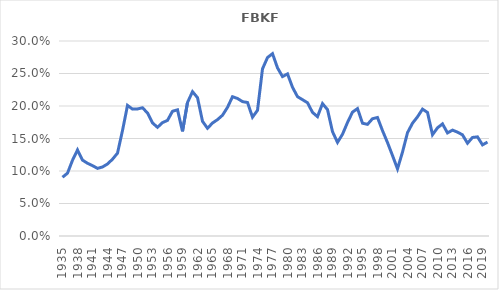
| Category | FBKF porcentaje del  PIB |
|---|---|
| 1935.0 | 0.09 |
| 1936.0 | 0.097 |
| 1937.0 | 0.117 |
| 1938.0 | 0.132 |
| 1939.0 | 0.117 |
| 1940.0 | 0.112 |
| 1941.0 | 0.108 |
| 1942.0 | 0.104 |
| 1943.0 | 0.106 |
| 1944.0 | 0.111 |
| 1945.0 | 0.118 |
| 1946.0 | 0.127 |
| 1947.0 | 0.162 |
| 1948.0 | 0.201 |
| 1949.0 | 0.195 |
| 1950.0 | 0.195 |
| 1951.0 | 0.197 |
| 1952.0 | 0.189 |
| 1953.0 | 0.174 |
| 1954.0 | 0.167 |
| 1955.0 | 0.174 |
| 1956.0 | 0.178 |
| 1957.0 | 0.192 |
| 1958.0 | 0.194 |
| 1959.0 | 0.161 |
| 1960.0 | 0.205 |
| 1961.0 | 0.222 |
| 1962.0 | 0.213 |
| 1963.0 | 0.176 |
| 1964.0 | 0.166 |
| 1965.0 | 0.174 |
| 1966.0 | 0.179 |
| 1967.0 | 0.186 |
| 1968.0 | 0.198 |
| 1969.0 | 0.214 |
| 1970.0 | 0.212 |
| 1971.0 | 0.207 |
| 1972.0 | 0.205 |
| 1973.0 | 0.183 |
| 1974.0 | 0.193 |
| 1975.0 | 0.257 |
| 1976.0 | 0.275 |
| 1977.0 | 0.281 |
| 1978.0 | 0.259 |
| 1979.0 | 0.245 |
| 1980.0 | 0.249 |
| 1981.0 | 0.229 |
| 1982.0 | 0.214 |
| 1983.0 | 0.21 |
| 1984.0 | 0.205 |
| 1985.0 | 0.19 |
| 1986.0 | 0.184 |
| 1987.0 | 0.204 |
| 1988.0 | 0.194 |
| 1989.0 | 0.161 |
| 1990.0 | 0.144 |
| 1991.0 | 0.157 |
| 1992.0 | 0.175 |
| 1993.0 | 0.191 |
| 1994.0 | 0.196 |
| 1995.0 | 0.174 |
| 1996.0 | 0.172 |
| 1997.0 | 0.18 |
| 1998.0 | 0.182 |
| 1999.0 | 0.162 |
| 2000.0 | 0.144 |
| 2001.0 | 0.124 |
| 2002.0 | 0.103 |
| 2003.0 | 0.129 |
| 2004.0 | 0.159 |
| 2005.0 | 0.174 |
| 2006.0 | 0.183 |
| 2007.0 | 0.195 |
| 2008.0 | 0.19 |
| 2009.0 | 0.156 |
| 2010.0 | 0.166 |
| 2011.0 | 0.172 |
| 2012.0 | 0.159 |
| 2013.0 | 0.163 |
| 2014.0 | 0.16 |
| 2015.0 | 0.156 |
| 2016.0 | 0.143 |
| 2017.0 | 0.152 |
| 2018.0 | 0.153 |
| 2019.0 | 0.14 |
| 2020.0 | 0.145 |